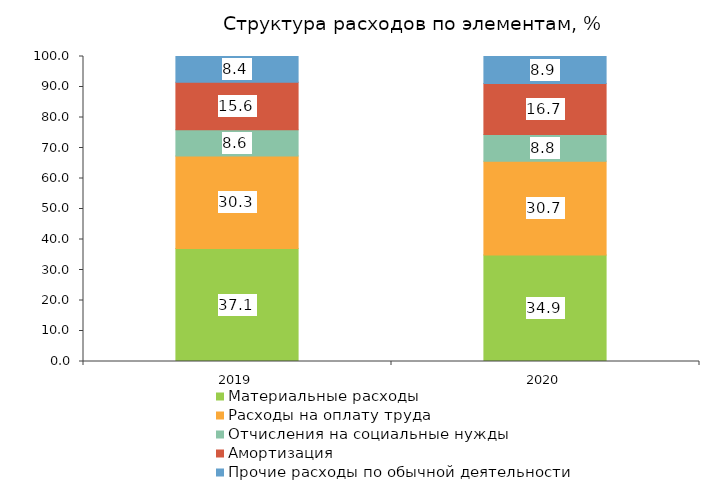
| Category | Материальные расходы | Расходы на оплату труда | Отчисления на социальные нужды | Амортизация | Прочие расходы по обычной деятельности |
|---|---|---|---|---|---|
| 2019.0 | 37.085 | 30.286 | 8.634 | 15.569 | 8.425 |
| 2020.0 | 34.934 | 30.714 | 8.751 | 16.739 | 8.862 |